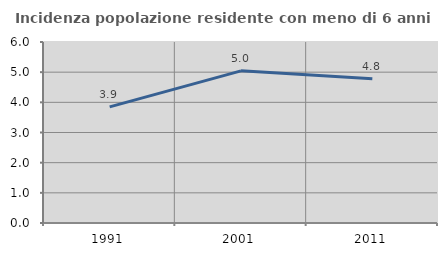
| Category | Incidenza popolazione residente con meno di 6 anni |
|---|---|
| 1991.0 | 3.851 |
| 2001.0 | 5.044 |
| 2011.0 | 4.781 |